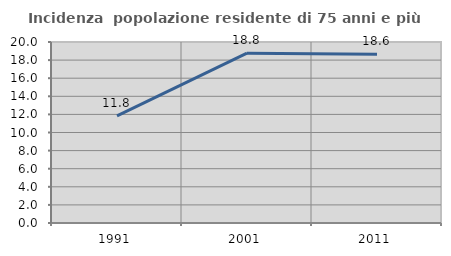
| Category | Incidenza  popolazione residente di 75 anni e più |
|---|---|
| 1991.0 | 11.826 |
| 2001.0 | 18.768 |
| 2011.0 | 18.65 |